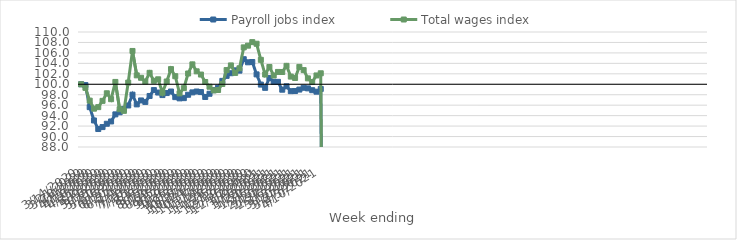
| Category | Payroll jobs index | Total wages index |
|---|---|---|
| 14/03/2020 | 100 | 100 |
| 21/03/2020 | 99.845 | 99.318 |
| 28/03/2020 | 95.624 | 96.872 |
| 04/04/2020 | 93.077 | 95.332 |
| 11/04/2020 | 91.439 | 95.626 |
| 18/04/2020 | 91.81 | 96.826 |
| 25/04/2020 | 92.448 | 98.279 |
| 02/05/2020 | 92.889 | 97.148 |
| 09/05/2020 | 94.244 | 100.448 |
| 16/05/2020 | 94.644 | 95.232 |
| 23/05/2020 | 95.297 | 94.916 |
| 30/05/2020 | 95.944 | 100.322 |
| 06/06/2020 | 98.012 | 106.372 |
| 13/06/2020 | 96.153 | 101.707 |
| 20/06/2020 | 96.906 | 101.24 |
| 27/06/2020 | 96.622 | 100.526 |
| 04/07/2020 | 97.764 | 102.192 |
| 11/07/2020 | 98.887 | 100.664 |
| 18/07/2020 | 98.418 | 100.952 |
| 25/07/2020 | 97.93 | 98.389 |
| 01/08/2020 | 98.319 | 100.53 |
| 08/08/2020 | 98.612 | 102.904 |
| 15/08/2020 | 97.538 | 101.543 |
| 22/08/2020 | 97.304 | 98.263 |
| 29/08/2020 | 97.349 | 99.261 |
| 05/09/2020 | 97.995 | 102.063 |
| 12/09/2020 | 98.448 | 103.807 |
| 19/09/2020 | 98.615 | 102.477 |
| 26/09/2020 | 98.511 | 101.86 |
| 03/10/2020 | 97.571 | 100.437 |
| 10/10/2020 | 98.184 | 99.533 |
| 17/10/2020 | 98.875 | 98.826 |
| 24/10/2020 | 99.348 | 98.902 |
| 31/10/2020 | 100.648 | 100.057 |
| 07/11/2020 | 101.608 | 102.716 |
| 14/11/2020 | 102.114 | 103.609 |
| 21/11/2020 | 102.665 | 102.173 |
| 28/11/2020 | 102.608 | 103.057 |
| 05/12/2020 | 104.796 | 107.057 |
| 12/12/2020 | 104.203 | 107.386 |
| 19/12/2020 | 104.257 | 108.06 |
| 26/12/2020 | 101.892 | 107.755 |
| 02/01/2021 | 99.94 | 104.677 |
| 09/01/2021 | 99.318 | 101.87 |
| 16/01/2021 | 101.186 | 103.312 |
| 23/01/2021 | 100.462 | 101.676 |
| 30/01/2021 | 100.464 | 102.362 |
| 06/02/2021 | 98.962 | 102.345 |
| 13/02/2021 | 99.607 | 103.524 |
| 20/02/2021 | 98.681 | 101.468 |
| 27/02/2021 | 98.706 | 101.205 |
| 06/03/2021 | 98.986 | 103.325 |
| 13/03/2021 | 99.33 | 102.711 |
| 20/03/2021 | 99.217 | 101.13 |
| 27/03/2021 | 98.868 | 100.443 |
| 03/04/2021 | 98.582 | 101.688 |
| 10/04/2021 | 99.105 | 102.103 |